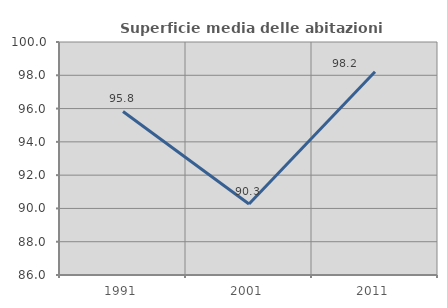
| Category | Superficie media delle abitazioni occupate |
|---|---|
| 1991.0 | 95.829 |
| 2001.0 | 90.265 |
| 2011.0 | 98.216 |